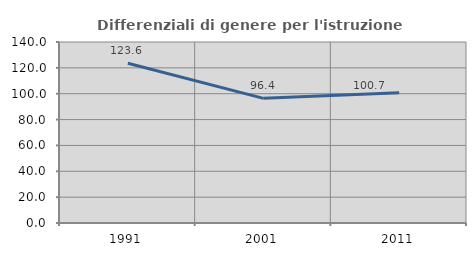
| Category | Differenziali di genere per l'istruzione superiore |
|---|---|
| 1991.0 | 123.563 |
| 2001.0 | 96.428 |
| 2011.0 | 100.666 |